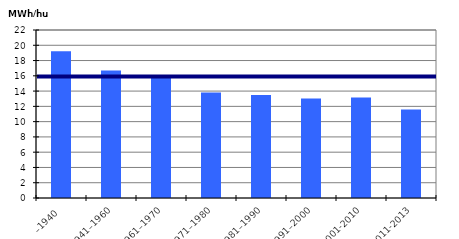
| Category | MWH/hus |
|---|---|
| –1940 | 19.21 |
| 1941–1960 | 16.685 |
| 1961–1970 | 16.038 |
| 1971–1980 | 13.821 |
| 1981–1990 | 13.496 |
| 1991–2000 | 13.043 |
| 2001-2010 | 13.177 |
| 2011-2013 | 11.588 |